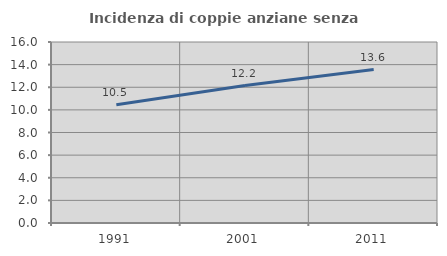
| Category | Incidenza di coppie anziane senza figli  |
|---|---|
| 1991.0 | 10.455 |
| 2001.0 | 12.152 |
| 2011.0 | 13.559 |